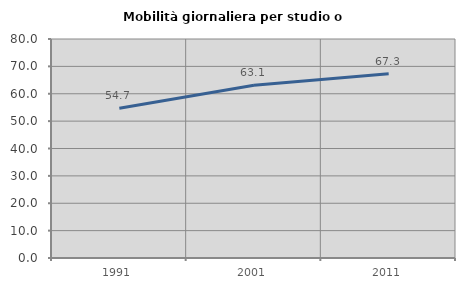
| Category | Mobilità giornaliera per studio o lavoro |
|---|---|
| 1991.0 | 54.724 |
| 2001.0 | 63.117 |
| 2011.0 | 67.31 |